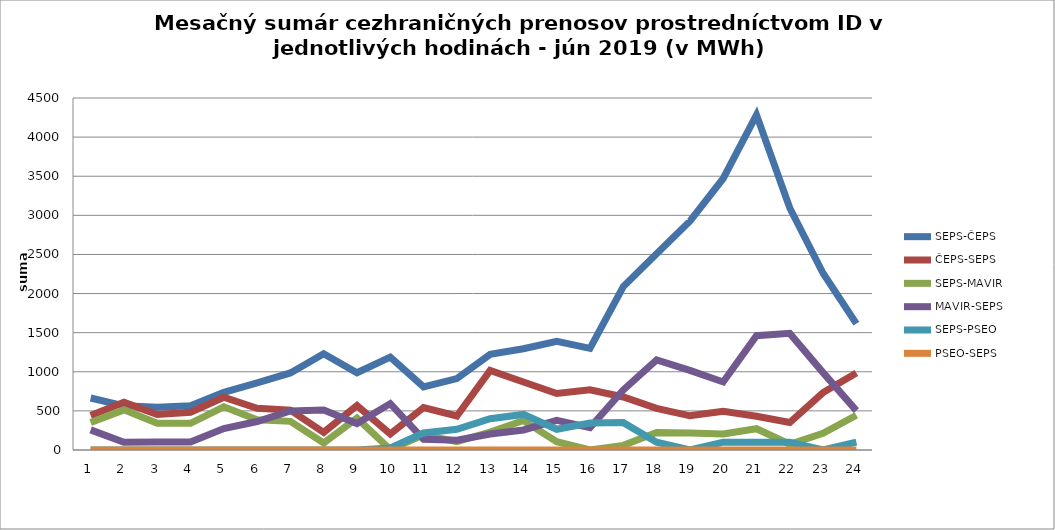
| Category | SEPS-ČEPS | ČEPS-SEPS | SEPS-MAVIR | MAVIR-SEPS | SEPS-PSEO | PSEO-SEPS |
|---|---|---|---|---|---|---|
| 1.0 | 665 | 441 | 352 | 257 | 0 | 0 |
| 2.0 | 565 | 609 | 513 | 98 | 0 | 0 |
| 3.0 | 546 | 453 | 341 | 101 | 0 | 0 |
| 4.0 | 566 | 482 | 341 | 102 | 0 | 0 |
| 5.0 | 736 | 675 | 552 | 274 | 0 | 0 |
| 6.0 | 857 | 533 | 387 | 364 | 0 | 0 |
| 7.0 | 985 | 510 | 366 | 499 | 0 | 0 |
| 8.0 | 1231 | 226 | 90 | 511 | 0 | 0 |
| 9.0 | 988 | 569 | 408 | 339 | 0 | 0 |
| 10.0 | 1187 | 206 | 7 | 593 | 25 | 0 |
| 11.0 | 807 | 543 | 193 | 137 | 218 | 0 |
| 12.0 | 913 | 435 | 106 | 126 | 265 | 0 |
| 13.0 | 1223 | 1017 | 230 | 204 | 400 | 0 |
| 14.0 | 1295 | 869 | 377 | 256 | 455 | 0 |
| 15.0 | 1389 | 722 | 106 | 380 | 265 | 0 |
| 16.0 | 1299 | 769 | 0 | 287 | 345 | 0 |
| 17.0 | 2090 | 678 | 59 | 769 | 350 | 0 |
| 18.0 | 2508 | 532 | 225 | 1151 | 100 | 0 |
| 19.0 | 2925 | 437 | 216 | 1017 | 0 | 0 |
| 20.0 | 3471 | 495 | 205 | 870 | 100 | 0 |
| 21.0 | 4284 | 432 | 272 | 1462 | 100 | 0 |
| 22.0 | 3094 | 351 | 73 | 1491 | 100 | 0 |
| 23.0 | 2259 | 734 | 214 | 989 | 0 | 0 |
| 24.0 | 1615 | 984 | 444 | 503 | 100 | 0 |